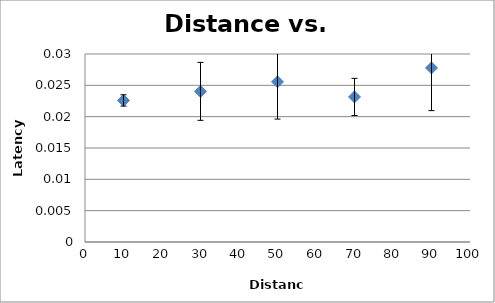
| Category | Mean |
|---|---|
| 10.0 | 0.023 |
| 30.0 | 0.024 |
| 50.0 | 0.026 |
| 70.0 | 0.023 |
| 90.0 | 0.028 |